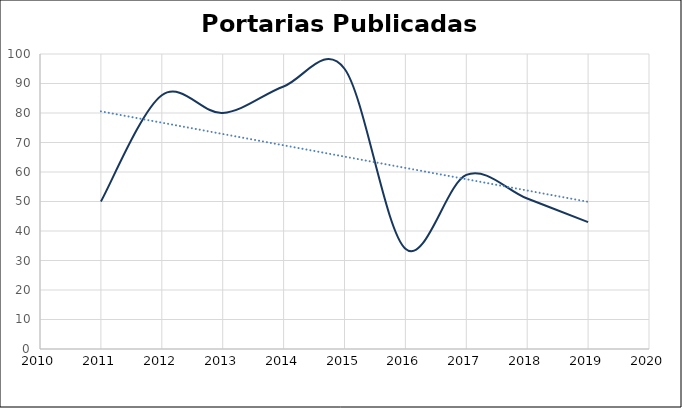
| Category | Portarias Publicadas |
|---|---|
| 2011.0 | 50 |
| 2012.0 | 86 |
| 2013.0 | 80 |
| 2014.0 | 89 |
| 2015.0 | 95 |
| 2016.0 | 34 |
| 2017.0 | 59 |
| 2018.0 | 51 |
| 2019.0 | 43 |